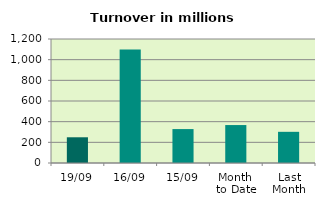
| Category | Series 0 |
|---|---|
| 19/09 | 248.918 |
| 16/09 | 1098.39 |
| 15/09 | 328.278 |
| Month 
to Date | 367.226 |
| Last
Month | 301.741 |